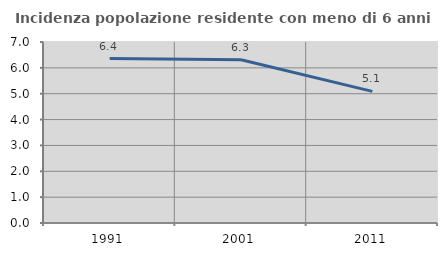
| Category | Incidenza popolazione residente con meno di 6 anni |
|---|---|
| 1991.0 | 6.358 |
| 2001.0 | 6.311 |
| 2011.0 | 5.092 |